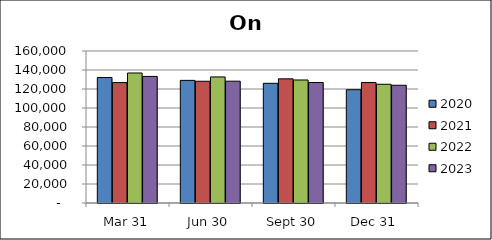
| Category | 2020 | 2021 | 2022 | 2023 |
|---|---|---|---|---|
| Mar 31 | 132103 | 126753 | 136844 | 133230 |
| Jun 30 | 129092 | 128167 | 132710 | 128230 |
| Sept 30 | 126003 | 130702 | 129496 | 126844 |
| Dec 31 | 119243 | 126845 | 124977 | 123937 |